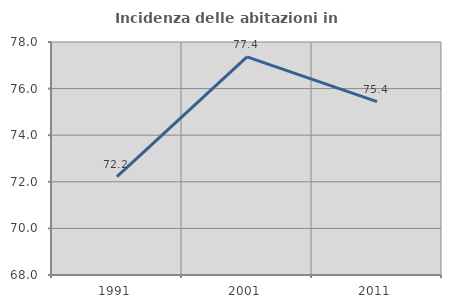
| Category | Incidenza delle abitazioni in proprietà  |
|---|---|
| 1991.0 | 72.222 |
| 2001.0 | 77.365 |
| 2011.0 | 75.44 |